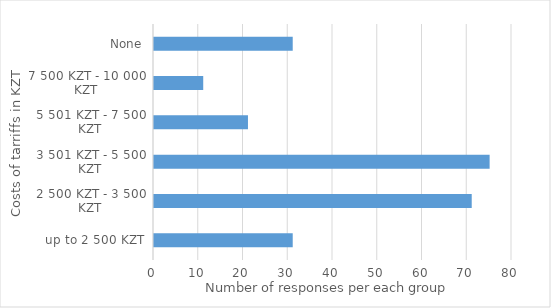
| Category | Series 0 |
|---|---|
|  up to 2 500 KZT | 31 |
| 2 500 KZT - 3 500 KZT | 71 |
| 3 501 KZT - 5 500 KZT | 75 |
| 5 501 KZT - 7 500 KZT | 21 |
| 7 500 KZT - 10 000 KZT | 11 |
| None | 31 |